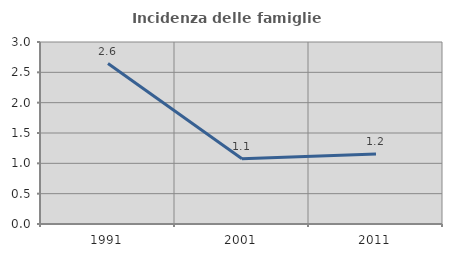
| Category | Incidenza delle famiglie numerose |
|---|---|
| 1991.0 | 2.644 |
| 2001.0 | 1.076 |
| 2011.0 | 1.155 |